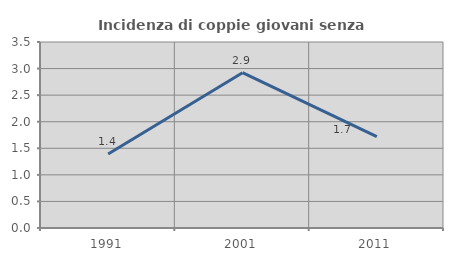
| Category | Incidenza di coppie giovani senza figli |
|---|---|
| 1991.0 | 1.394 |
| 2001.0 | 2.922 |
| 2011.0 | 1.718 |